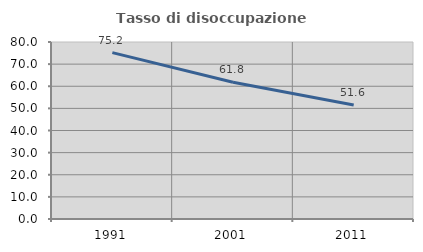
| Category | Tasso di disoccupazione giovanile  |
|---|---|
| 1991.0 | 75.215 |
| 2001.0 | 61.814 |
| 2011.0 | 51.562 |